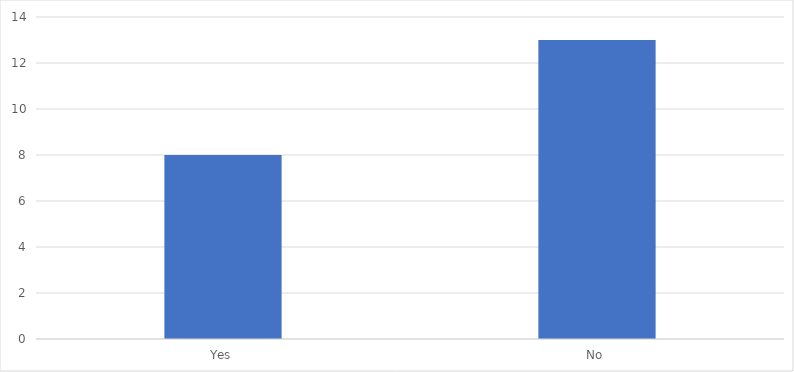
| Category | Number of Responses |
|---|---|
| Yes | 8 |
| No | 13 |